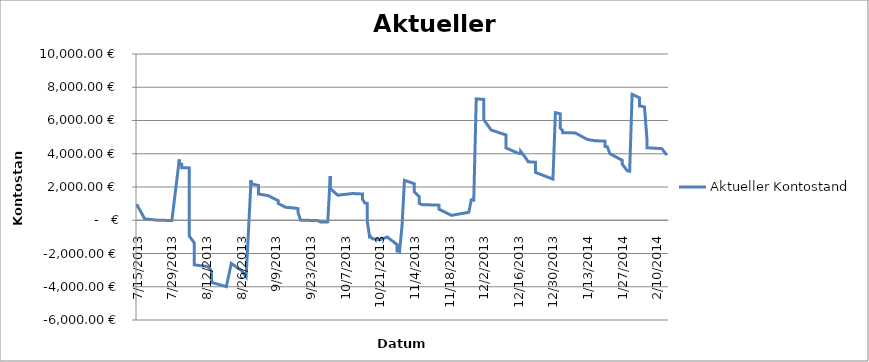
| Category | Aktueller Kontostand |
|---|---|
| 7/15/13 | 980 |
| 7/15/13 | 960 |
| 7/15/13 | 932.6 |
| 7/15/13 | 879.31 |
| 7/15/13 | 864.31 |
| 7/16/13 | 636.66 |
| 7/18/13 | 87.06 |
| 7/23/13 | 4.85 |
| 7/29/13 | -17.22 |
| 8/1/13 | 3656.01 |
| 8/1/13 | 3646.17 |
| 8/1/13 | 3517.2 |
| 8/1/13 | 3426.71 |
| 8/1/13 | 3376.96 |
| 8/2/13 | 3366.96 |
| 8/2/13 | 3163.26 |
| 8/5/13 | 3149 |
| 8/5/13 | 2749 |
| 8/5/13 | -341 |
| 8/5/13 | -450.3 |
| 8/5/13 | -505.3 |
| 8/5/13 | -865.62 |
| 8/5/13 | -920.62 |
| 8/5/13 | -948.52 |
| 8/7/13 | -1348.52 |
| 8/7/13 | -2548.52 |
| 8/7/13 | -2683.32 |
| 8/12/13 | -2776.02 |
| 8/12/13 | -2791.02 |
| 8/13/13 | -2843.9 |
| 8/14/13 | -3071.55 |
| 8/14/13 | -3737.55 |
| 8/20/13 | -3993.52 |
| 8/22/13 | -2601.52 |
| 8/26/13 | -3001.52 |
| 8/28/13 | -3401.52 |
| 8/28/13 | -3423.59 |
| 8/30/13 | 2404.94 |
| 8/30/13 | 2194.94 |
| 9/2/13 | 2092.15 |
| 9/2/13 | 1999.47 |
| 9/2/13 | 1870.5 |
| 9/2/13 | 1780.01 |
| 9/2/13 | 1576.31 |
| 9/2/13 | 1562.05 |
| 9/3/13 | 1552.05 |
| 9/6/13 | 1477.24 |
| 9/10/13 | 1177.24 |
| 9/10/13 | 1007.59 |
| 9/13/13 | 779.94 |
| 9/16/13 | 744.07 |
| 9/16/13 | 729.07 |
| 9/18/13 | 698.28 |
| 9/18/13 | 674.28 |
| 9/18/13 | 654.28 |
| 9/18/13 | 589.68 |
| 9/18/13 | 569.68 |
| 9/18/13 | 458.93 |
| 9/18/13 | 450.93 |
| 9/19/13 | 3.17 |
| 9/26/13 | -18.9 |
| 9/27/13 | -98.9 |
| 9/30/13 | -97.8 |
| 9/30/13 | -98.08 |
| 9/30/13 | -101.08 |
| 9/30/13 | -116.08 |
| 10/1/13 | 2656.6 |
| 10/1/13 | 2507.57 |
| 10/1/13 | 2378.6 |
| 10/1/13 | 2275.81 |
| 10/1/13 | 2185.32 |
| 10/1/13 | 2171.06 |
| 10/1/13 | 2161.06 |
| 10/1/13 | 2111.31 |
| 10/1/13 | 1907.61 |
| 10/4/13 | 1507.61 |
| 10/10/13 | 1607.61 |
| 10/14/13 | 1579.61 |
| 10/14/13 | 1564.61 |
| 10/14/13 | 1264.61 |
| 10/15/13 | 1036.96 |
| 10/16/13 | 1016.96 |
| 10/16/13 | 996.96 |
| 10/16/13 | 976.96 |
| 10/16/13 | 956.96 |
| 10/16/13 | 902.16 |
| 10/16/13 | -97.84 |
| 10/17/13 | -1080.61 |
| 10/17/13 | -929.71 |
| 10/18/13 | -1108.71 |
| 10/21/13 | -1182.73 |
| 10/24/13 | -1007.43 |
| 10/28/13 | -1461.45 |
| 10/28/13 | -1481.45 |
| 10/28/13 | -1580.65 |
| 10/28/13 | -1850.65 |
| 10/29/13 | -1872.72 |
| 10/30/13 | -372.72 |
| 10/31/13 | 2399.96 |
| 11/4/13 | 2196.26 |
| 11/4/13 | 2047.23 |
| 11/4/13 | 1944.44 |
| 11/4/13 | 1929.85 |
| 11/4/13 | 1800.88 |
| 11/4/13 | 1710.39 |
| 11/4/13 | 1700.39 |
| 11/6/13 | 1410.39 |
| 11/6/13 | 1013.79 |
| 11/7/13 | 940.89 |
| 11/14/13 | 907.49 |
| 11/14/13 | 892.49 |
| 11/14/13 | 664.84 |
| 11/19/13 | 292.69 |
| 11/26/13 | 480.49 |
| 11/27/13 | 1230.49 |
| 11/28/13 | 1208.42 |
| 11/29/13 | 7301.61 |
| 12/2/13 | 7266.61 |
| 12/2/13 | 7159.29 |
| 12/2/13 | 7090.89 |
| 12/2/13 | 7019.69 |
| 12/2/13 | 6779.69 |
| 12/2/13 | 6744.69 |
| 12/2/13 | 6724.69 |
| 12/2/13 | 6704.69 |
| 12/2/13 | 6697.67 |
| 12/2/13 | 6548.82 |
| 12/2/13 | 6399.79 |
| 12/2/13 | 6297 |
| 12/2/13 | 6282.41 |
| 12/2/13 | 6153.44 |
| 12/2/13 | 6062.95 |
| 12/2/13 | 6052.95 |
| 12/3/13 | 5849.25 |
| 12/3/13 | 5799.5 |
| 12/5/13 | 5429.5 |
| 12/11/13 | 5129.5 |
| 12/11/13 | 4515.5 |
| 12/11/13 | 4415.49 |
| 12/11/13 | 4394.07 |
| 12/11/13 | 4374.07 |
| 12/11/13 | 4354.07 |
| 12/11/13 | 4315.07 |
| 12/16/13 | 4025.07 |
| 12/17/13 | 4017.07 |
| 12/17/13 | 4136.6 |
| 12/19/13 | 3744.29 |
| 12/20/13 | 3516.64 |
| 12/23/13 | 3489.84 |
| 12/23/13 | 3474.84 |
| 12/23/13 | 3274.84 |
| 12/23/13 | 2874.84 |
| 12/30/13 | 2474.84 |
| 12/30/13 | 2452.77 |
| 12/31/13 | 6471.92 |
| 12/31/13 | 6473.72 |
| 12/31/13 | 6473.27 |
| 12/31/13 | 6470.27 |
| 12/31/13 | 6455.27 |
| 1/2/14 | 6401.27 |
| 1/2/14 | 6279.28 |
| 1/2/14 | 6250.08 |
| 1/2/14 | 6230.08 |
| 1/2/14 | 6200.08 |
| 1/2/14 | 6170.08 |
| 1/2/14 | 6146.08 |
| 1/2/14 | 6126.08 |
| 1/2/14 | 6106.08 |
| 1/2/14 | 6086.08 |
| 1/2/14 | 5878.18 |
| 1/2/14 | 5749.21 |
| 1/2/14 | 5658.72 |
| 1/2/14 | 5540.22 |
| 1/2/14 | 5525.63 |
| 1/3/14 | 5370.7 |
| 1/3/14 | 5263.87 |
| 1/8/14 | 5253.87 |
| 1/13/14 | 4853.87 |
| 1/16/14 | 4784 |
| 1/20/14 | 4759 |
| 1/20/14 | 4691.4 |
| 1/20/14 | 4613.4 |
| 1/20/14 | 4583.4 |
| 1/20/14 | 4555.4 |
| 1/20/14 | 4446.1 |
| 1/21/14 | 4419.3 |
| 1/21/14 | 4404.3 |
| 1/22/14 | 4004.3 |
| 1/27/14 | 3604.3 |
| 1/27/14 | 3376.65 |
| 1/29/14 | 2976.65 |
| 1/30/14 | 2950.89 |
| 1/31/14 | 7574.59 |
| 2/3/14 | 7366.69 |
| 2/3/14 | 7211.76 |
| 2/3/14 | 7104.93 |
| 2/3/14 | 7090.34 |
| 2/3/14 | 6961.37 |
| 2/3/14 | 6870.88 |
| 2/4/14 | 6860.88 |
| 2/5/14 | 6811.13 |
| 2/6/14 | 4871.13 |
| 2/6/14 | 4767.33 |
| 2/6/14 | 4361.31 |
| 2/12/14 | 4307.38 |
| 2/14/14 | 3917.38 |
| 2/14/14 | 3890.58 |
| 2/14/14 | 3875.58 |